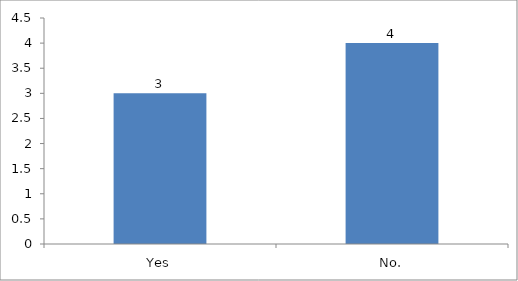
| Category | Have you attended any session on Youth-led Changemaking before? |
|---|---|
| Yes | 3 |
| No. | 4 |